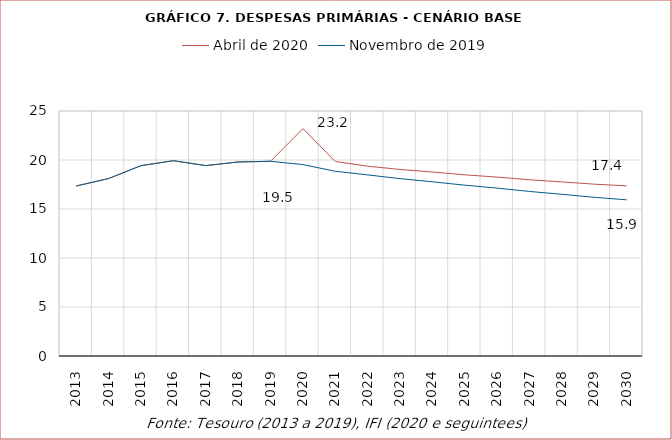
| Category | Abril de 2020 | Novembro de 2019 |
|---|---|---|
| 2013.0 | 17.348 | 17.348 |
| 2014.0 | 18.109 | 18.109 |
| 2015.0 | 19.421 | 19.421 |
| 2016.0 | 19.929 | 19.929 |
| 2017.0 | 19.428 | 19.428 |
| 2018.0 | 19.798 | 19.798 |
| 2019.0 | 19.869 | 19.869 |
| 2020.0 | 23.198 | 19.529 |
| 2021.0 | 19.847 | 18.851 |
| 2022.0 | 19.37 | 18.481 |
| 2023.0 | 19.034 | 18.097 |
| 2024.0 | 18.771 | 17.774 |
| 2025.0 | 18.486 | 17.43 |
| 2026.0 | 18.255 | 17.13 |
| 2027.0 | 17.981 | 16.79 |
| 2028.0 | 17.765 | 16.498 |
| 2029.0 | 17.533 | 16.191 |
| 2030.0 | 17.359 | 15.934 |